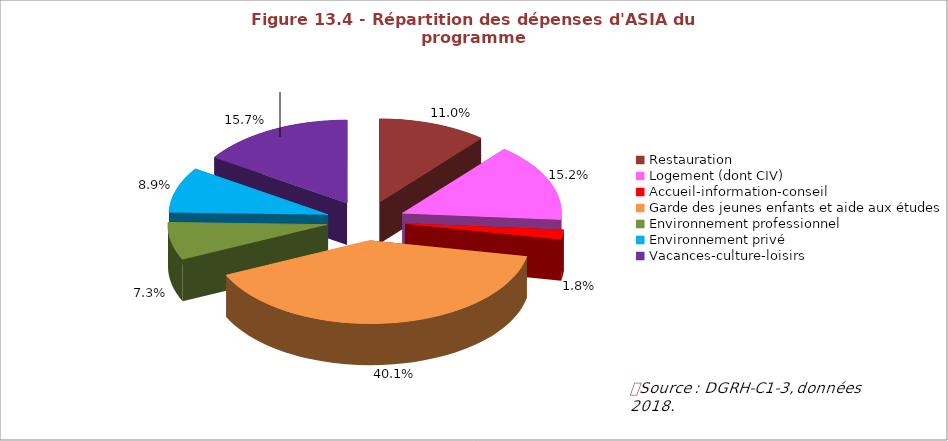
| Category | Figue 10.4 - Répartion des dépenses d'ASIA du programme "Soutien à la politique de l'éducation nationale" par type, en 2015 |
|---|---|
| Restauration | 0.11 |
| Logement (dont CIV)  | 0.152 |
| Accueil-information-conseil | 0.018 |
| Garde des jeunes enfants et aide aux études | 0.401 |
| Environnement professionnel | 0.073 |
| Environnement privé | 0.089 |
| Vacances-culture-loisirs | 0.157 |